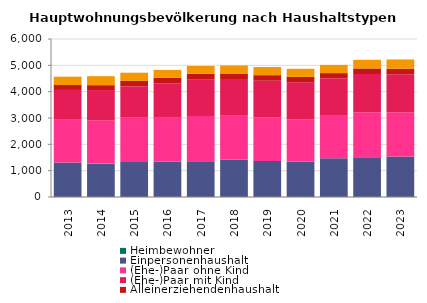
| Category | Heimbewohner | Einpersonenhaushalt | (Ehe-)Paar ohne Kind | (Ehe-)Paar mit Kind | Alleinerziehendenhaushalt | sonstiger Mehrpersonenhaushalt |
|---|---|---|---|---|---|---|
| 2013.0 | 0 | 1310 | 1625 | 1130 | 188 | 317 |
| 2014.0 | 0 | 1268 | 1646 | 1148 | 185 | 341 |
| 2015.0 | 0 | 1331 | 1685 | 1187 | 206 | 311 |
| 2016.0 | 0 | 1337 | 1673 | 1298 | 218 | 299 |
| 2017.0 | 0 | 1361 | 1715 | 1382 | 224 | 296 |
| 2018.0 | 17 | 1400 | 1667 | 1397 | 209 | 305 |
| 2019.0 | 17 | 1349 | 1667 | 1382 | 212 | 308 |
| 2020.0 | 14 | 1337 | 1604 | 1400 | 206 | 308 |
| 2021.0 | 17 | 1457 | 1643 | 1394 | 194 | 311 |
| 2022.0 | 17 | 1496 | 1709 | 1448 | 212 | 329 |
| 2023.0 | 17 | 1520 | 1679 | 1445 | 206 | 356 |